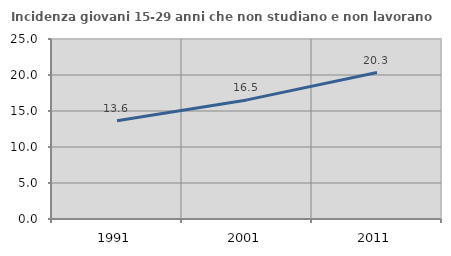
| Category | Incidenza giovani 15-29 anni che non studiano e non lavorano  |
|---|---|
| 1991.0 | 13.636 |
| 2001.0 | 16.541 |
| 2011.0 | 20.339 |